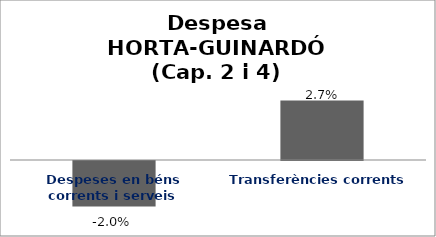
| Category | Series 0 |
|---|---|
| Despeses en béns corrents i serveis | -0.02 |
| Transferències corrents | 0.027 |